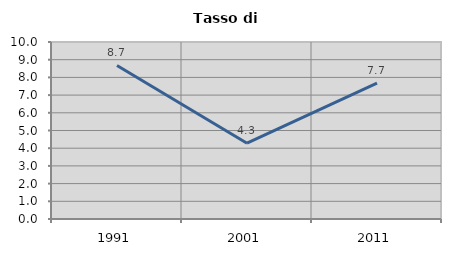
| Category | Tasso di disoccupazione   |
|---|---|
| 1991.0 | 8.675 |
| 2001.0 | 4.282 |
| 2011.0 | 7.675 |